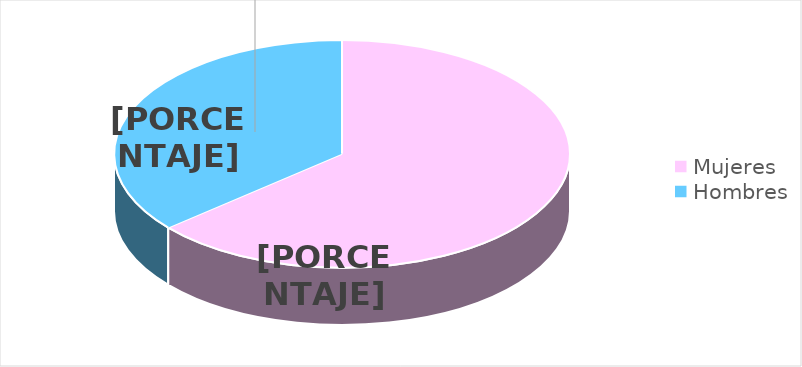
| Category | Series 0 |
|---|---|
| Mujeres | 192 |
| Hombres | 109 |